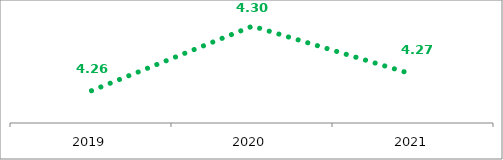
| Category | Engagement des employés |
|---|---|
| 2019.0 | 4.26 |
| 2020.0 | 4.3 |
| 2021.0 | 4.27 |